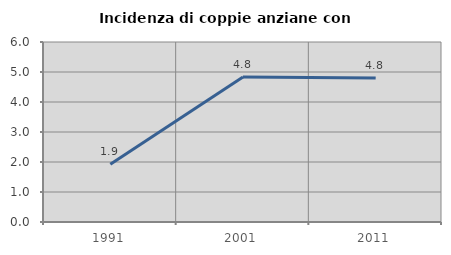
| Category | Incidenza di coppie anziane con figli |
|---|---|
| 1991.0 | 1.922 |
| 2001.0 | 4.835 |
| 2011.0 | 4.799 |